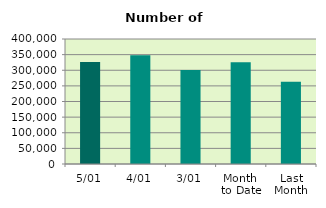
| Category | Series 0 |
|---|---|
| 5/01 | 326752 |
| 4/01 | 348260 |
| 3/01 | 300596 |
| Month 
to Date | 325202.667 |
| Last
Month | 263242 |